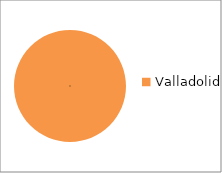
| Category | Series 0 |
|---|---|
| Valladolid | 8 |